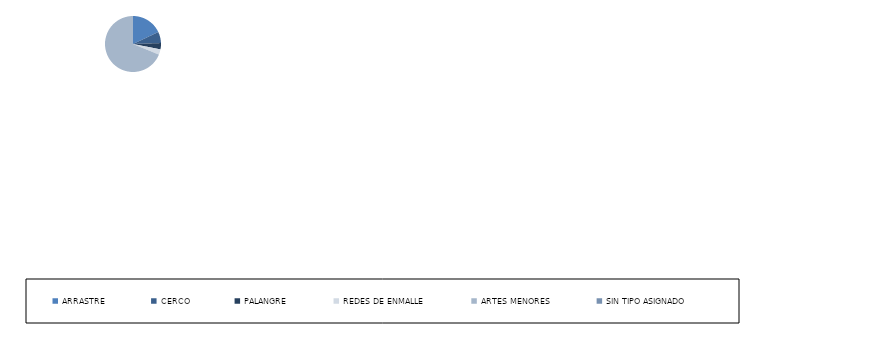
| Category | Series 0 |
|---|---|
| ARRASTRE | 179 |
| CERCO | 65 |
| PALANGRE | 36 |
| REDES DE ENMALLE | 31 |
| ARTES MENORES | 686 |
| SIN TIPO ASIGNADO | 0 |